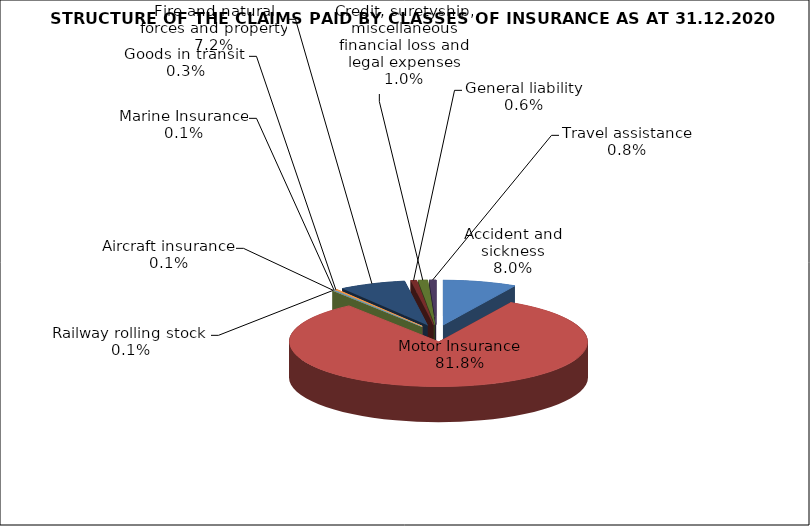
| Category | Accident and sickness |
|---|---|
| Accident and sickness | 0.08 |
| Motor Insurance | 0.818 |
| Railway rolling stock  | 0.001 |
| Aircraft insurance | 0.001 |
| Marine Insurance | 0.001 |
| Goods in transit  | 0.003 |
| Fire and natural forces and property | 0.072 |
| General liability | 0.006 |
| Credit, suretyship, miscellaneous financial loss and legal expenses | 0.01 |
| Travel assistance | 0.008 |